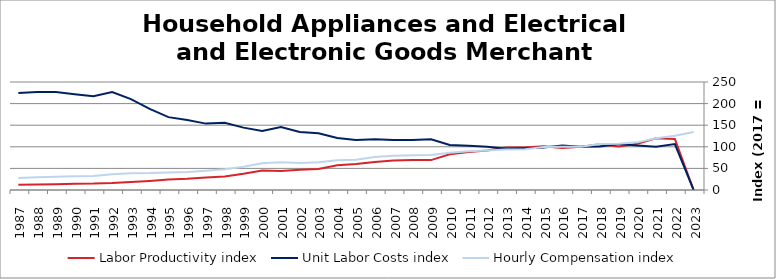
| Category | Labor Productivity index | Unit Labor Costs index | Hourly Compensation index |
|---|---|---|---|
| 2023.0 | 0 | 0 | 134.17 |
| 2022.0 | 118.235 | 106.218 | 125.587 |
| 2021.0 | 119.691 | 100.186 | 119.913 |
| 2020.0 | 106.992 | 103.057 | 110.263 |
| 2019.0 | 100.734 | 106.558 | 107.341 |
| 2018.0 | 105.824 | 100.45 | 106.301 |
| 2017.0 | 100 | 100 | 100 |
| 2016.0 | 96.983 | 103.24 | 100.125 |
| 2015.0 | 101.533 | 98.146 | 99.651 |
| 2014.0 | 98.119 | 96.403 | 94.589 |
| 2013.0 | 98.197 | 95.287 | 93.568 |
| 2012.0 | 91.64 | 99.867 | 91.518 |
| 2011.0 | 87.784 | 102.39 | 89.881 |
| 2010.0 | 82.66 | 104.021 | 85.984 |
| 2009.0 | 69.247 | 117.339 | 81.253 |
| 2008.0 | 69.506 | 115.824 | 80.504 |
| 2007.0 | 68.346 | 115.811 | 79.152 |
| 2006.0 | 64.88 | 117.598 | 76.298 |
| 2005.0 | 60.168 | 115.963 | 69.772 |
| 2004.0 | 57.174 | 120.507 | 68.899 |
| 2003.0 | 48.827 | 131.3 | 64.11 |
| 2002.0 | 46.598 | 134.186 | 62.528 |
| 2001.0 | 43.91 | 145.856 | 64.045 |
| 2000.0 | 45.263 | 136.382 | 61.731 |
| 1999.0 | 37.378 | 144.39 | 53.97 |
| 1998.0 | 31.012 | 155.499 | 48.224 |
| 1997.0 | 29.092 | 153.665 | 44.704 |
| 1996.0 | 25.766 | 161.911 | 41.718 |
| 1995.0 | 24.094 | 168.692 | 40.644 |
| 1994.0 | 20.901 | 187.828 | 39.257 |
| 1993.0 | 18.458 | 210.497 | 38.854 |
| 1992.0 | 16.125 | 226.985 | 36.6 |
| 1991.0 | 14.796 | 217.285 | 32.15 |
| 1990.0 | 14.478 | 221.811 | 32.115 |
| 1989.0 | 13.572 | 226.914 | 30.798 |
| 1988.0 | 12.883 | 227.114 | 29.259 |
| 1987.0 | 12.299 | 224.674 | 27.632 |